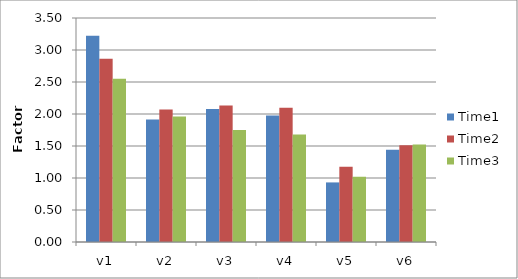
| Category | Time1 | Time2 | Time3 |
|---|---|---|---|
| v1 | 3.222 | 2.863 | 2.55 |
| v2 | 1.915 | 2.072 | 1.961 |
| v3 | 2.08 | 2.133 | 1.751 |
| v4 | 1.975 | 2.098 | 1.678 |
| v5 | 0.931 | 1.175 | 1.021 |
| v6 | 1.441 | 1.512 | 1.523 |